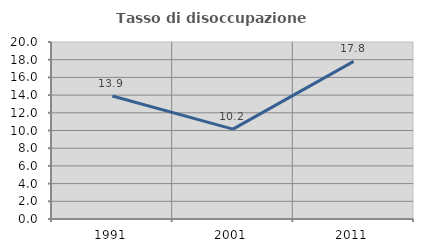
| Category | Tasso di disoccupazione giovanile  |
|---|---|
| 1991.0 | 13.904 |
| 2001.0 | 10.15 |
| 2011.0 | 17.816 |